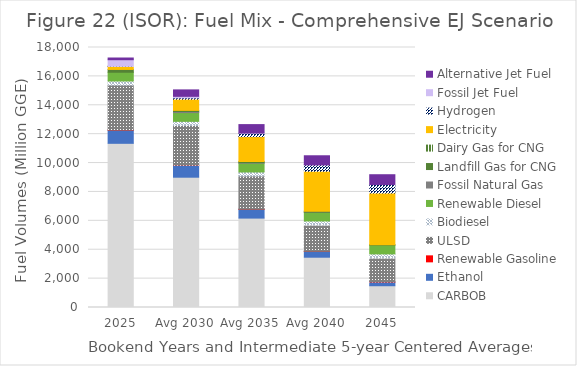
| Category | CARBOB | Ethanol | Renewable Gasoline | ULSD | Biodiesel | Renewable Diesel | Fossil Natural Gas | Landfill Gas for CNG | Dairy Gas for CNG | Electricity | Hydrogen | Fossil Jet Fuel | Alternative Jet Fuel |
|---|---|---|---|---|---|---|---|---|---|---|---|---|---|
| 2025 | 11366.128 | 913.355 | 5.922 | 3114.041 | 281.157 | 606.318 | 0 | 193.871 | 0 | 213.013 | 5.314 | 455.722 | 117.884 |
| Avg 2030 | 9020.443 | 823.986 | 5.922 | 2756.31 | 281.157 | 606.318 | 78.374 | 73.799 | 0 | 777.105 | 87.448 | 108.754 | 445.472 |
| Avg 2035 | 6189.922 | 609.626 | 5.922 | 2297.661 | 281.157 | 606.318 | 42.77 | 73.799 | 0 | 1722.918 | 241.867 | 5.869 | 584.614 |
| Avg 2040 | 3481.839 | 404.539 | 5.922 | 1818.243 | 281.157 | 606.318 | 5.281 | 67.655 | 0 | 2762.485 | 436.496 | 0 | 634.735 |
| 2045 | 1506.59 | 254.95 | 5.922 | 1661.862 | 281.157 | 606.318 | 0 | 32.937 | 0 | 3572.892 | 592.954 | 0 | 676.938 |